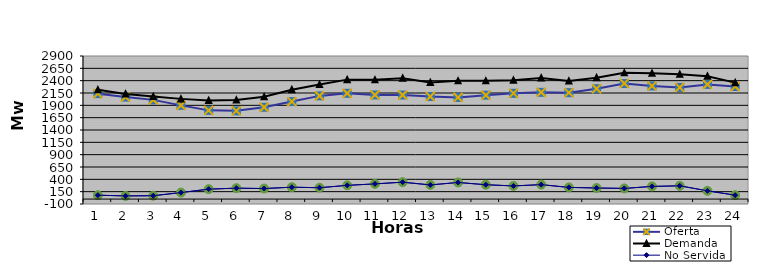
| Category | Oferta | No Servida | Demanda |
|---|---|---|---|
| 1.0 | 2137.05 | 78.564 | 2215.614 |
| 2.0 | 2066.78 | 63.991 | 2130.771 |
| 3.0 | 2010.62 | 67.704 | 2078.324 |
| 4.0 | 1899.44 | 131.445 | 2030.885 |
| 5.0 | 1797.97 | 201.297 | 1999.267 |
| 6.0 | 1788.21 | 221.03 | 2009.24 |
| 7.0 | 1860.99 | 213.333 | 2074.323 |
| 8.0 | 1976.08 | 240.626 | 2216.706 |
| 9.0 | 2091.6 | 230.092 | 2321.692 |
| 10.0 | 2143.55 | 277.547 | 2421.097 |
| 11.0 | 2110.31 | 307.793 | 2418.103 |
| 12.0 | 2109.18 | 342.046 | 2451.226 |
| 13.0 | 2078.08 | 286.84 | 2364.92 |
| 14.0 | 2060.18 | 336.387 | 2396.567 |
| 15.0 | 2105.74 | 290.598 | 2396.338 |
| 16.0 | 2143.94 | 266.375 | 2410.315 |
| 17.0 | 2163.56 | 292.662 | 2456.222 |
| 18.0 | 2156.76 | 236.567 | 2393.327 |
| 19.0 | 2236.74 | 224.27 | 2461.01 |
| 20.0 | 2343.08 | 215.859 | 2558.939 |
| 21.0 | 2292.58 | 256.525 | 2549.105 |
| 22.0 | 2263.26 | 268.453 | 2531.713 |
| 23.0 | 2324.04 | 167.181 | 2491.221 |
| 24.0 | 2281.14 | 78.702 | 2359.842 |